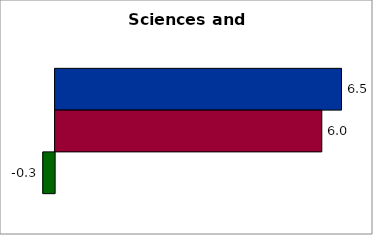
| Category | 50 states and D.C. | SREB states | State |
|---|---|---|---|
| 0 | 6.491 | 6.044 | -0.267 |